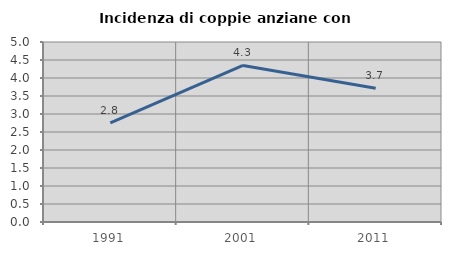
| Category | Incidenza di coppie anziane con figli |
|---|---|
| 1991.0 | 2.75 |
| 2001.0 | 4.348 |
| 2011.0 | 3.716 |